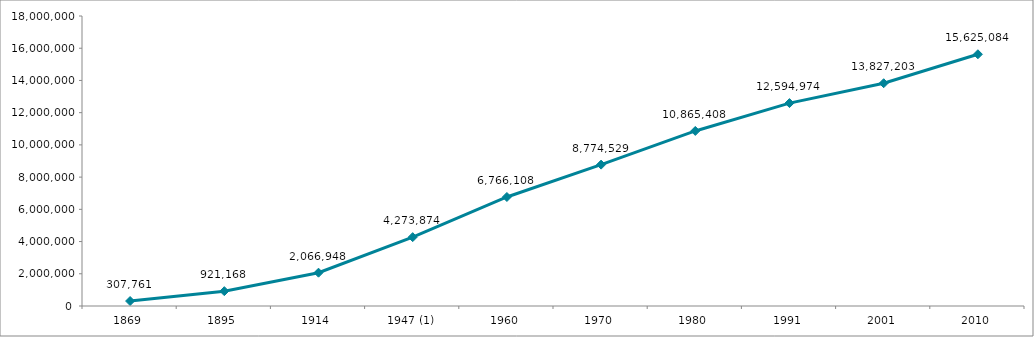
| Category | Evolución de la población censal  |
|---|---|
| 1869 | 307761 |
| 1895 | 921168 |
| 1914 | 2066948 |
| 1947 (1) | 4273874 |
| 1960 | 6766108 |
| 1970 | 8774529 |
| 1980 | 10865408 |
| 1991 | 12594974 |
| 2001 | 13827203 |
| 2010 | 15625084 |